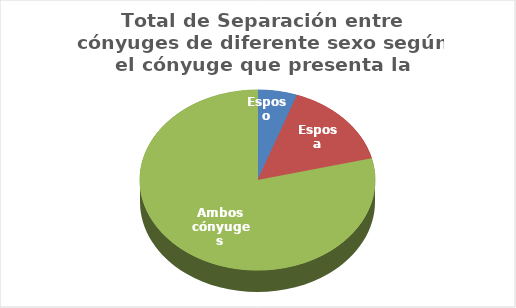
| Category | Series 0 |
|---|---|
| Esposo | 170 |
| Esposa | 491 |
| Ambos cónyuges | 2471 |